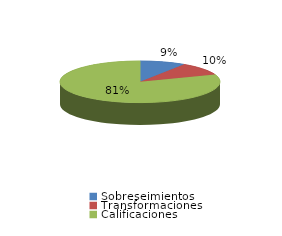
| Category | Series 0 |
|---|---|
| Sobreseimientos | 151 |
| Transformaciones | 166 |
| Calificaciones | 1324 |